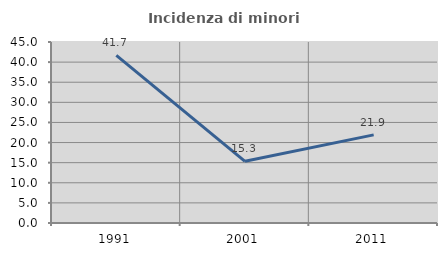
| Category | Incidenza di minori stranieri |
|---|---|
| 1991.0 | 41.667 |
| 2001.0 | 15.333 |
| 2011.0 | 21.905 |